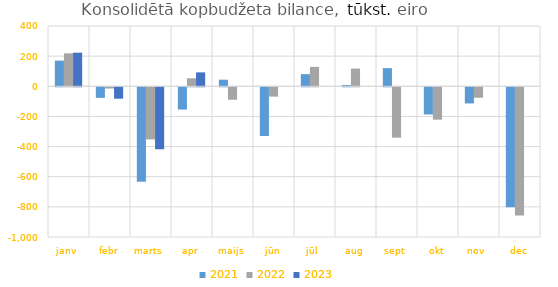
| Category | 2021 | 2022 | 2023 |
|---|---|---|---|
| janv | 170157.398 | 218389.091 | 223039.368 |
| febr | -70037.902 | -8203.95 | -75727.525 |
| marts | -626307.766 | -345869.737 | -411380.469 |
| apr | -147810.305 | 53138.837 | 92355.55 |
| maijs | 43702.036 | -82553.768 | 0 |
| jūn | -323251.437 | -61976.694 | 0 |
| jūl | 80650.706 | 128860.015 | 0 |
| aug | 8217.929 | 117341.161 | 0 |
| sept | 120460.062 | -334219.509 | 0 |
| okt | -180467.443 | -214870.466 | 0 |
| nov | -107114.455 | -69420.277 | 0 |
| dec | -796518.828 | -851302.945 | 0 |